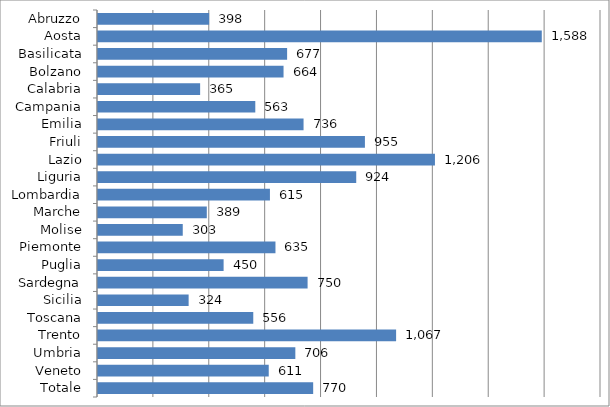
| Category | Series 0 |
|---|---|
| Abruzzo | 397.719 |
| Aosta | 1588.083 |
| Basilicata | 676.739 |
| Bolzano | 663.984 |
| Calabria | 365.493 |
| Campania | 562.878 |
| Emilia | 735.59 |
| Friuli | 955.188 |
| Lazio | 1205.745 |
| Liguria | 924.064 |
| Lombardia | 615.277 |
| Marche | 389.363 |
| Molise | 303.302 |
| Piemonte | 635.065 |
| Puglia | 449.502 |
| Sardegna | 750.051 |
| Sicilia | 324.339 |
| Toscana | 555.642 |
| Trento | 1066.804 |
| Umbria | 706.193 |
| Veneto | 611.003 |
| Totale | 769.994 |